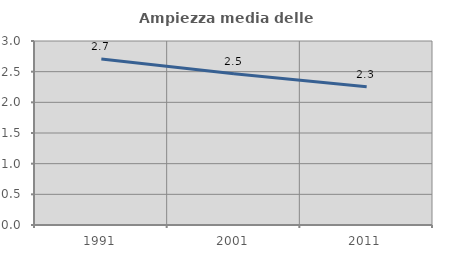
| Category | Ampiezza media delle famiglie |
|---|---|
| 1991.0 | 2.705 |
| 2001.0 | 2.467 |
| 2011.0 | 2.254 |